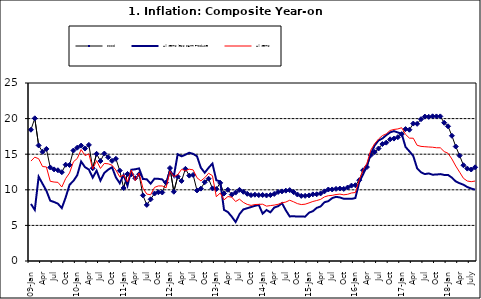
| Category | Food | All Items less Farm Produce | All Items |
|---|---|---|---|
| 09-Jan | 18.436 | 8.013 | 14.034 |
| Feb | 20.041 | 7.178 | 14.584 |
| Mar | 16.233 | 11.842 | 14.366 |
| Apr | 15.342 | 10.85 | 13.268 |
| May | 15.74 | 9.88 | 13.212 |
| June | 13.138 | 8.472 | 11.194 |
| Jul | 12.867 | 8.285 | 11.09 |
| Aug | 12.746 | 8.044 | 11.046 |
| Sep | 12.472 | 7.431 | 10.39 |
| Oct | 13.524 | 8.933 | 11.588 |
| Nov | 13.482 | 10.702 | 12.368 |
| Dec | 15.518 | 11.249 | 13.93 |
| 10-Jan | 15.918 | 12.063 | 14.398 |
| Feb | 16.208 | 13.978 | 15.649 |
| Mar | 15.79 | 13.184 | 14.812 |
| Apr | 16.306 | 12.844 | 15.044 |
| May | 13.023 | 11.711 | 12.915 |
| Jun | 15.053 | 12.686 | 14.099 |
| Jul | 14.043 | 11.287 | 13.002 |
| Aug | 15.09 | 12.366 | 13.702 |
| Sep | 14.57 | 12.83 | 13.65 |
| Oct | 14.065 | 13.168 | 13.45 |
| Nov | 14.351 | 11.746 | 12.766 |
| Dec | 12.701 | 10.917 | 11.815 |
| 11-Jan | 10.255 | 12.118 | 12.08 |
| Feb | 12.221 | 10.569 | 11.1 |
| Mar | 12.169 | 12.815 | 12.779 |
| Apr | 11.629 | 12.882 | 11.291 |
| May | 12.179 | 13.006 | 12.352 |
| Jun | 9.22 | 11.524 | 10.23 |
| Jul | 7.877 | 11.472 | 9.397 |
| Aug | 8.665 | 10.863 | 9.301 |
| Sep | 9.479 | 11.567 | 10.339 |
| Oct | 9.656 | 11.539 | 10.544 |
| Nov | 9.623 | 11.459 | 10.54 |
| Dec | 11.02 | 10.822 | 10.283 |
| 12-Jan | 13.053 | 12.748 | 12.626 |
| 12-Feb | 9.729 | 11.901 | 11.866 |
| 12-Mar | 11.848 | 14.995 | 12.111 |
| Apr | 11.246 | 14.703 | 12.866 |
| May | 12.942 | 14.926 | 12.688 |
| Jun | 11.991 | 15.199 | 12.892 |
| Jul | 12.093 | 15.045 | 12.797 |
| Aug | 9.91 | 14.714 | 11.689 |
| Sep | 10.164 | 13.101 | 11.253 |
| Oct | 11.064 | 12.398 | 11.693 |
| Nov | 11.553 | 13.092 | 12.32 |
| Dec | 10.199 | 13.685 | 11.981 |
| 13-Jan | 10.106 | 11.342 | 9.031 |
| Feb | 10.973 | 11.184 | 9.542 |
| Mar | 9.482 | 7.179 | 8.593 |
| Apr | 10.006 | 6.874 | 9.052 |
| May | 9.321 | 6.227 | 8.964 |
| Jun | 9.606 | 5.472 | 8.353 |
| Jul | 9.994 | 6.58 | 8.682 |
| Aug | 9.723 | 7.245 | 8.231 |
| Sep | 9.437 | 7.41 | 7.952 |
| Oct | 9.249 | 7.579 | 7.807 |
| Nov | 9.313 | 7.75 | 7.931 |
| Dec | 9.253 | 7.872 | 7.957 |
| 14-Jan | 9.271 | 6.648 | 7.977 |
| Feb | 9.207 | 7.166 | 7.707 |
| Mar | 9.254 | 6.836 | 7.783 |
| Apr | 9.414 | 7.508 | 7.851 |
| May | 9.698 | 7.693 | 7.965 |
| Jun | 9.776 | 8.122 | 8.167 |
| Jul | 9.878 | 7.116 | 8.281 |
| Aug | 9.959 | 6.264 | 8.534 |
| Sep | 9.676 | 6.278 | 8.317 |
| Oct | 9.343 | 6.252 | 8.06 |
| Nov | 9.144 | 6.255 | 7.927 |
| Dec | 9.152 | 6.225 | 7.978 |
| 15-Jan | 9.215 | 6.787 | 8.157 |
| Feb | 9.359 | 6.994 | 8.359 |
| Mar | 9.376 | 7.46 | 8.494 |
| Apr | 9.49 | 7.661 | 8.655 |
| May | 9.782 | 8.253 | 9.003 |
| Jun | 10.041 | 8.403 | 9.168 |
| Jul | 10.049 | 8.83 | 9.218 |
| Aug | 10.131 | 9.01 | 9.336 |
| Sep | 10.174 | 8.928 | 9.394 |
| Oct | 10.129 | 8.742 | 9.296 |
| Nov | 10.321 | 8.732 | 9.368 |
| Dec | 10.588 | 8.727 | 9.554 |
| 16-Jan | 10.642 | 8.841 | 9.617 |
| Feb | 11.348 | 11.041 | 11.379 |
| Mar | 12.745 | 12.17 | 12.775 |
| Apr | 13.194 | 13.352 | 13.721 |
| May | 14.861 | 15.054 | 15.577 |
| Jun | 15.302 | 16.224 | 16.48 |
| Jul | 15.799 | 16.929 | 17.127 |
| Aug | 16.427 | 17.208 | 17.609 |
| Sep | 16.622 | 17.666 | 17.852 |
| Oct | 17.09 | 18.067 | 18.33 |
| Nov | 17.191 | 18.241 | 18.476 |
| Dec | 17.388 | 18.052 | 18.547 |
| 17-Jan | 17.818 | 17.867 | 18.719 |
| Feb | 18.528 | 16.011 | 17.78 |
| Mar | 18.436 | 15.404 | 17.256 |
| Apr | 19.303 | 14.75 | 17.244 |
| May | 19.266 | 13.016 | 16.251 |
| Jun | 19.915 | 12.455 | 16.098 |
| Jul | 20.284 | 12.207 | 16.053 |
| Aug | 20.251 | 12.296 | 16.012 |
| Sep | 20.321 | 12.123 | 15.979 |
| Oct | 20.306 | 12.142 | 15.905 |
| Nov | 20.308 | 12.206 | 15.901 |
| Dec | 19.415 | 12.089 | 15.372 |
| 18-Jan | 18.919 | 12.09 | 15.127 |
| Feb | 17.588 | 11.707 | 14.33 |
| Mar | 16.08 | 11.181 | 13.337 |
| Apr | 14.799 | 10.92 | 12.482 |
| May | 13.448 | 10.71 | 11.608 |
| June | 12.977 | 10.387 | 11.231 |
| July | 12.85 | 10.183 | 11.142 |
| August | 13.158 | 10.015 | 11.227 |